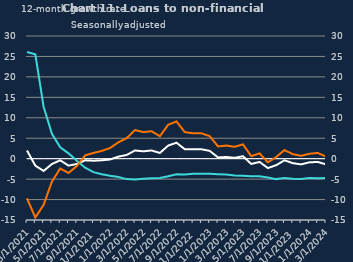
| Category | zero | Non-financial businesses | SMEs |
|---|---|---|---|
| Mar-2021 |  | 2 | 26.1 |
| Apr-2021 |  | -1.7 | 25.5 |
| May-2021 |  | -3 | 12.7 |
| Jun-2021 |  | -1.3 | 6.1 |
| Jul-2021 |  | -0.4 | 2.8 |
| Aug-2021 |  | -1.7 | 1.3 |
| Sep-2021 |  | -1.3 | -0.5 |
| Oct-2021 |  | -0.4 | -2.2 |
| Nov-2021 |  | -0.5 | -3.3 |
| Dec-2021 |  | -0.4 | -3.8 |
| Jan-2022 |  | -0.2 | -4.2 |
| Feb-2022 |  | 0.5 | -4.5 |
| Mar-2022 |  | 0.9 | -5 |
| Apr-2022 |  | 2 | -5.1 |
| May-2022 |  | 1.8 | -4.9 |
| Jun-2022 |  | 2 | -4.8 |
| Jul-2022 |  | 1.4 | -4.7 |
| Aug-2022 |  | 3.2 | -4.3 |
| Sep-2022 |  | 3.9 | -3.8 |
| Oct-2022 |  | 2.3 | -3.9 |
| Nov-2022 |  | 2.3 | -3.7 |
| Dec-2022 |  | 2.3 | -3.7 |
| Jan-2023 |  | 1.9 | -3.7 |
| Feb-2023 |  | 0.3 | -3.8 |
| Mar-2023 |  | 0.4 | -3.9 |
| Apr-2023 |  | 0.2 | -4.1 |
| May-2023 |  | 0.6 | -4.2 |
| Jun-2023 |  | -1.3 | -4.3 |
| Jul-2023 |  | -0.8 | -4.3 |
| Aug-2023 |  | -2.3 | -4.6 |
| Sep-2023 |  | -1.6 | -5 |
| Oct-2023 |  | -0.4 | -4.7 |
| Nov-2023 |  | -1.1 | -4.9 |
| Dec-2023 |  | -1.4 | -5 |
| Jan-2024 |  | -0.9 | -4.7 |
| Feb-2024 |  | -0.8 | -4.8 |
| Mar-2024 |  | -1.4 | -4.7 |